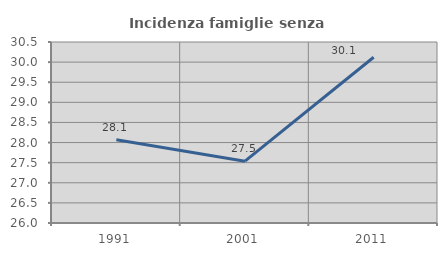
| Category | Incidenza famiglie senza nuclei |
|---|---|
| 1991.0 | 28.068 |
| 2001.0 | 27.538 |
| 2011.0 | 30.12 |